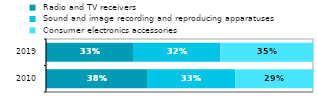
| Category |  Radio and TV receivers |  Sound and image recording and reproducing apparatuses |  Consumer electronics accessories |
|---|---|---|---|
| 2010 | 0.381 | 0.328 | 0.291 |
| 2019 | 0.329 | 0.325 | 0.346 |